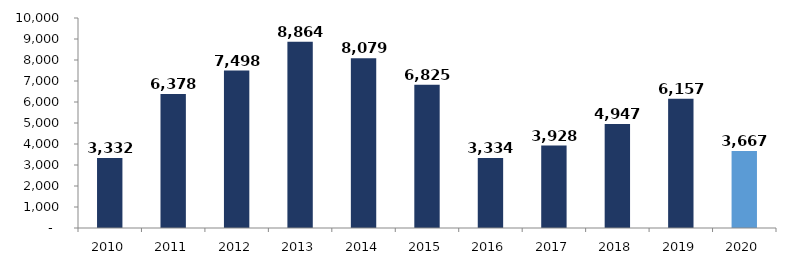
| Category | Series 0 |
|---|---|
| 2010.0 | 3331.554 |
| 2011.0 | 6377.615 |
| 2012.0 | 7498.207 |
| 2013.0 | 8863.622 |
| 2014.0 | 8079.21 |
| 2015.0 | 6824.624 |
| 2016.0 | 3333.564 |
| 2017.0 | 3928.017 |
| 2018.0 | 4947.435 |
| 2019.0 | 6157.132 |
| 2020.0 | 3667.034 |